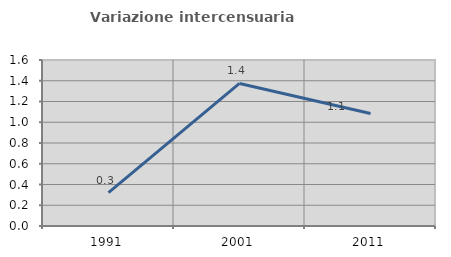
| Category | Variazione intercensuaria annua |
|---|---|
| 1991.0 | 0.322 |
| 2001.0 | 1.374 |
| 2011.0 | 1.084 |